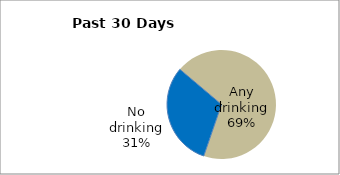
| Category | Series 0 |
|---|---|
| No drinking | 30.89 |
| Any drinking | 69.11 |